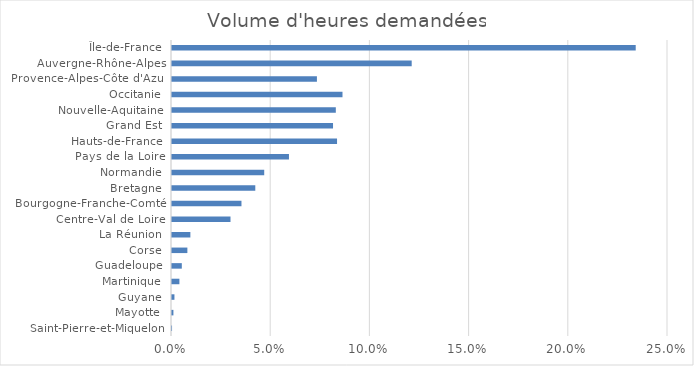
| Category | Volume d'heures demandées |
|---|---|
| Saint-Pierre-et-Miquelon | 0 |
| Mayotte | 0.001 |
| Guyane | 0.001 |
| Martinique | 0.004 |
| Guadeloupe | 0.005 |
| Corse | 0.008 |
| La Réunion | 0.009 |
| Centre-Val de Loire | 0.029 |
| Bourgogne-Franche-Comté | 0.035 |
| Bretagne | 0.042 |
| Normandie | 0.046 |
| Pays de la Loire | 0.059 |
| Hauts-de-France | 0.083 |
| Grand Est | 0.081 |
| Nouvelle-Aquitaine | 0.083 |
| Occitanie | 0.086 |
| Provence-Alpes-Côte d'Azur | 0.073 |
| Auvergne-Rhône-Alpes | 0.121 |
| Île-de-France | 0.234 |